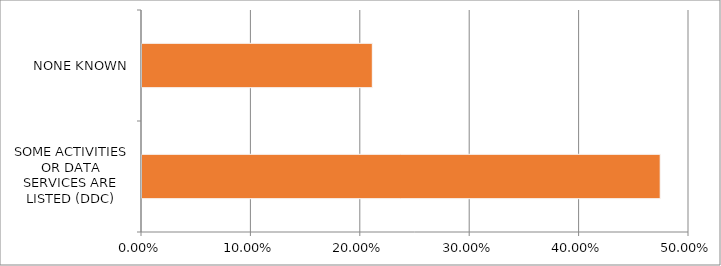
| Category | Series 0 |
|---|---|
| SOME ACTIVITIES OR DATA SERVICES ARE LISTED (DDC) | 0.474 |
| NONE KNOWN | 0.211 |